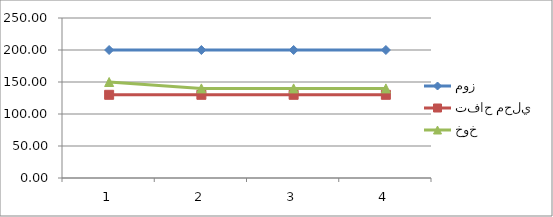
| Category | موز | تفاح محلي | خوخ |
|---|---|---|---|
| 0 | 200 | 130 | 150 |
| 1 | 200 | 130 | 140 |
| 2 | 200 | 130 | 140 |
| 3 | 200 | 130 | 140 |